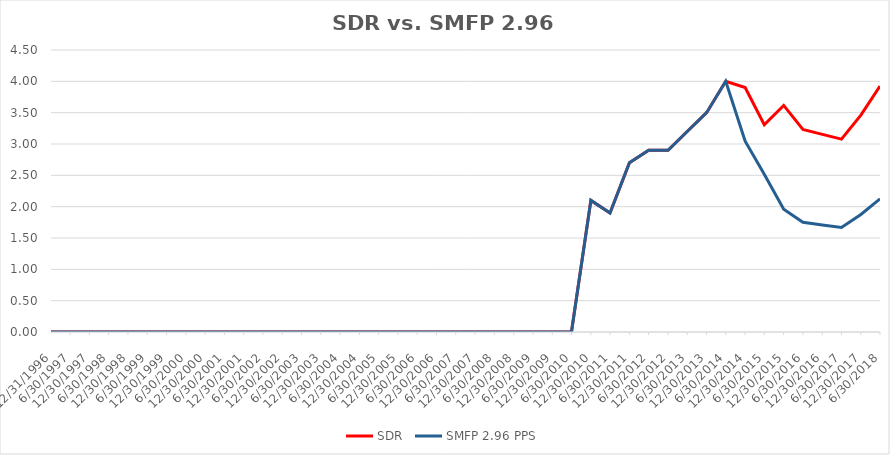
| Category | SDR | SMFP 2.96 PPS |
|---|---|---|
| 12/31/96 | 0 | 0 |
| 6/30/97 | 0 | 0 |
| 12/31/97 | 0 | 0 |
| 6/30/98 | 0 | 0 |
| 12/31/98 | 0 | 0 |
| 6/30/99 | 0 | 0 |
| 12/31/99 | 0 | 0 |
| 6/30/00 | 0 | 0 |
| 12/31/00 | 0 | 0 |
| 6/30/01 | 0 | 0 |
| 12/31/01 | 0 | 0 |
| 6/30/02 | 0 | 0 |
| 12/31/02 | 0 | 0 |
| 6/30/03 | 0 | 0 |
| 12/31/03 | 0 | 0 |
| 6/30/04 | 0 | 0 |
| 12/31/04 | 0 | 0 |
| 6/30/05 | 0 | 0 |
| 12/31/05 | 0 | 0 |
| 6/30/06 | 0 | 0 |
| 12/31/06 | 0 | 0 |
| 6/30/07 | 0 | 0 |
| 12/31/07 | 0 | 0 |
| 6/30/08 | 0 | 0 |
| 12/31/08 | 0 | 0 |
| 6/30/09 | 0 | 0 |
| 12/31/09 | 0 | 0 |
| 6/30/10 | 0 | 0 |
| 12/31/10 | 2.1 | 2.1 |
| 6/30/11 | 1.9 | 1.9 |
| 12/31/11 | 2.7 | 2.7 |
| 6/30/12 | 2.9 | 2.9 |
| 12/31/12 | 2.9 | 2.9 |
| 6/30/13 | 3.2 | 3.2 |
| 12/31/13 | 3.5 | 3.5 |
| 6/30/14 | 4 | 4 |
| 12/31/14 | 3.9 | 3.044 |
| 6/30/15 | 3.308 | 2.517 |
| 12/31/15 | 3.615 | 1.958 |
| 6/30/16 | 3.231 | 1.75 |
| 12/31/16 | 3.154 | 1.708 |
| 6/30/17 | 3.077 | 1.667 |
| 12/31/17 | 3.462 | 1.875 |
| 6/30/18 | 3.923 | 2.125 |